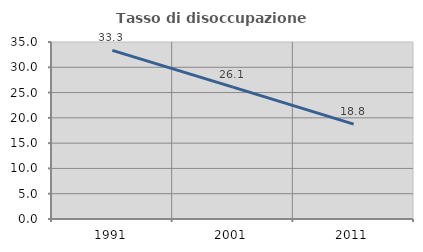
| Category | Tasso di disoccupazione giovanile  |
|---|---|
| 1991.0 | 33.333 |
| 2001.0 | 26.087 |
| 2011.0 | 18.75 |